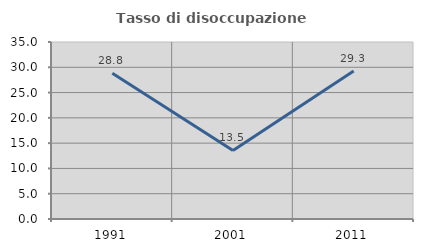
| Category | Tasso di disoccupazione giovanile  |
|---|---|
| 1991.0 | 28.824 |
| 2001.0 | 13.549 |
| 2011.0 | 29.287 |